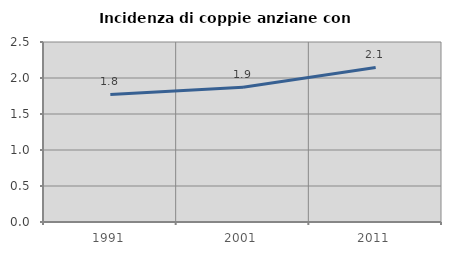
| Category | Incidenza di coppie anziane con figli |
|---|---|
| 1991.0 | 1.772 |
| 2001.0 | 1.871 |
| 2011.0 | 2.146 |